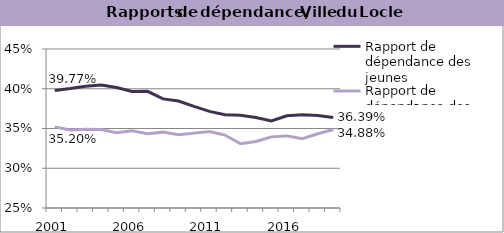
| Category | Rapport de dépendance des jeunes | Rapport de dépendance des personnes âgées |
|---|---|---|
| 2001.0 | 0.398 | 0.352 |
| 2002.0 | 0.4 | 0.348 |
| 2003.0 | 0.403 | 0.349 |
| 2004.0 | 0.405 | 0.349 |
| 2005.0 | 0.402 | 0.345 |
| 2006.0 | 0.397 | 0.347 |
| 2007.0 | 0.397 | 0.343 |
| 2008.0 | 0.387 | 0.345 |
| 2009.0 | 0.385 | 0.342 |
| 2010.0 | 0.378 | 0.344 |
| 2011.0 | 0.372 | 0.346 |
| 2012.0 | 0.367 | 0.342 |
| 2013.0 | 0.367 | 0.331 |
| 2014.0 | 0.364 | 0.334 |
| 2015.0 | 0.359 | 0.339 |
| 2016.0 | 0.366 | 0.341 |
| 2017.0 | 0.367 | 0.337 |
| 2018.0 | 0.366 | 0.343 |
| 2019.0 | 0.364 | 0.349 |